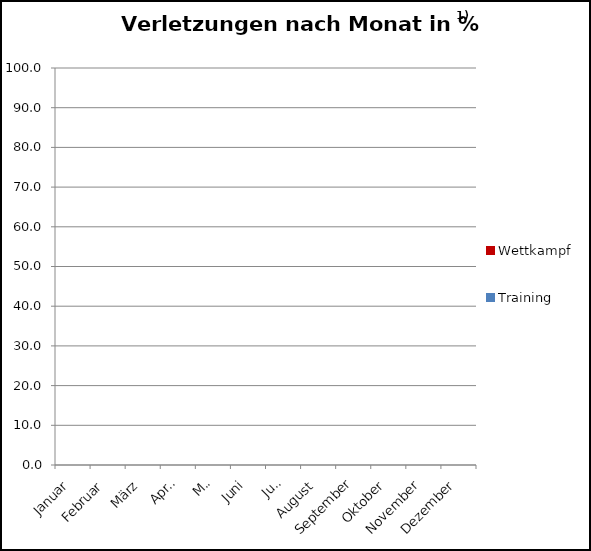
| Category | Wettkampf | Training |
|---|---|---|
| Januar | 0 | 0 |
| Februar | 0 | 0 |
| März | 0 | 0 |
| April | 0 | 0 |
| Mai | 0 | 0 |
| Juni | 0 | 0 |
| Juli | 0 | 0 |
| August | 0 | 0 |
| September | 0 | 0 |
| Oktober | 0 | 0 |
| November | 0 | 0 |
| Dezember | 0 | 0 |